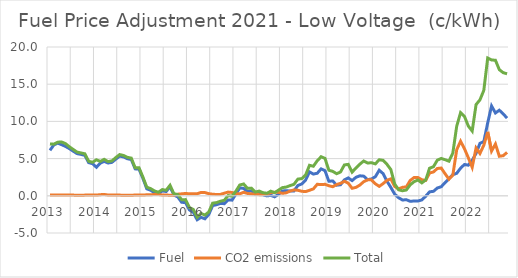
| Category | Fuel | CO2 emissions | Total |
|---|---|---|---|
| 2013.0 | 6.108 | 0.093 | 6.972 |
| 2013.0 | 6.834 | 0.098 | 6.94 |
| 2013.0 | 7.081 | 0.12 | 7.208 |
| 2013.0 | 6.873 | 0.12 | 7.234 |
| 2013.0 | 6.645 | 0.124 | 7.019 |
| 2013.0 | 6.344 | 0.104 | 6.6 |
| 2013.0 | 6 | 0.094 | 6.233 |
| 2013.0 | 5.672 | 0.075 | 5.873 |
| 2013.0 | 5.566 | 0.074 | 5.763 |
| 2013.0 | 5.441 | 0.092 | 5.649 |
| 2013.0 | 4.459 | 0.104 | 4.64 |
| 2013.0 | 4.32 | 0.112 | 4.503 |
| 2014.0 | 3.838 | 0.096 | 4.838 |
| 2014.0 | 4.385 | 0.152 | 4.621 |
| 2014.0 | 4.632 | 0.177 | 4.903 |
| 2014.0 | 4.405 | 0.111 | 4.595 |
| 2014.0 | 4.494 | 0.117 | 4.691 |
| 2014.0 | 4.928 | 0.106 | 5.135 |
| 2014.0 | 5.33 | 0.095 | 5.543 |
| 2014.0 | 5.23 | 0.074 | 5.417 |
| 2014.0 | 4.982 | 0.073 | 5.166 |
| 2014.0 | 4.873 | 0.084 | 5.065 |
| 2014.0 | 3.62 | 0.095 | 3.771 |
| 2014.0 | 3.583 | 0.108 | 3.763 |
| 2015.0 | 2.34 | 0.098 | 2.522 |
| 2015.0 | 0.94 | 0.137 | 1.158 |
| 2015.0 | 0.741 | 0.156 | 0.964 |
| 2015.0 | 0.419 | 0.16 | 0.651 |
| 2015.0 | 0.262 | 0.174 | 0.481 |
| 2015.0 | 0.665 | 0.11 | 0.835 |
| 2015.0 | 0.576 | 0.101 | 0.745 |
| 2015.0 | 1.23 | 0.08 | 1.41 |
| 2015.0 | 0.107 | 0.072 | 0.275 |
| 2015.0 | -0.154 | 0.218 | 0.175 |
| 2015.0 | -0.873 | 0.263 | -0.523 |
| 2015.0 | -0.907 | 0.318 | -0.514 |
| 2016.0 | -1.898 | 0.265 | -1.569 |
| 2016.0 | -2.216 | 0.291 | -1.835 |
| 2016.0 | -3.221 | 0.28 | -2.885 |
| 2016.0 | -2.897 | 0.449 | -2.359 |
| 2016.0 | -3.09 | 0.435 | -2.597 |
| 2016.0 | -2.515 | 0.284 | -2.175 |
| 2016.0 | -1.317 | 0.212 | -0.989 |
| 2016.0 | -1.196 | 0.174 | -0.914 |
| 2016.0 | -1.028 | 0.188 | -0.731 |
| 2016.0 | -1.058 | 0.349 | -0.604 |
| 2016.0 | -0.556 | 0.498 | 0.034 |
| 2016.0 | -0.583 | 0.451 | -0.057 |
| 2017.0 | 0.221 | 0.271 | 0.624 |
| 2017.0 | 1.061 | 0.259 | 1.455 |
| 2017.0 | 0.998 | 0.476 | 1.588 |
| 2017.0 | 0.577 | 0.311 | 1 |
| 2017.0 | 0.667 | 0.265 | 1.029 |
| 2017.0 | 0.206 | 0.211 | 0.5 |
| 2017.0 | 0.356 | 0.154 | 0.636 |
| 2017.0 | 0.128 | 0.159 | 0.419 |
| 2017.0 | -0.012 | 0.227 | 0.338 |
| 2017.0 | 0.059 | 0.432 | 0.621 |
| 2017.0 | -0.135 | 0.473 | 0.419 |
| 2017.0 | 0.197 | 0.469 | 0.758 |
| 2018.0 | 0.654 | 0.335 | 1.098 |
| 2018.0 | 0.679 | 0.401 | 1.17 |
| 2018.0 | 0.65 | 0.64 | 1.376 |
| 2018.0 | 0.653 | 0.79 | 1.547 |
| 2018.0 | 1.385 | 0.745 | 2.246 |
| 2018.0 | 1.591 | 0.606 | 2.307 |
| 2018.0 | 2.116 | 0.571 | 2.795 |
| 2018.0 | 3.213 | 0.74 | 4.099 |
| 2018.0 | 2.92 | 0.929 | 3.973 |
| 2018.0 | 3.031 | 1.544 | 4.71 |
| 2018.0 | 3.621 | 1.514 | 5.251 |
| 2018.0 | 3.38 | 1.542 | 5.03 |
| 2019.0 | 1.952 | 1.355 | 3.432 |
| 2019.0 | 1.997 | 1.22 | 3.286 |
| 2019.0 | 1.427 | 1.51 | 2.969 |
| 2019.0 | 1.482 | 1.678 | 3.197 |
| 2019.0 | 2.138 | 1.949 | 4.143 |
| 2019.0 | 2.406 | 1.694 | 4.228 |
| 2019.0 | 2.044 | 1.012 | 3.178 |
| 2019.0 | 2.488 | 1.132 | 3.746 |
| 2019.0 | 2.688 | 1.444 | 4.255 |
| 2019.0 | 2.641 | 1.897 | 4.676 |
| 2019.0 | 2.17 | 2.143 | 4.403 |
| 2019.0 | 2.26 | 2.144 | 4.448 |
| 2020.0 | 2.567 | 1.613 | 4.292 |
| 2020.0 | 3.433 | 1.269 | 4.844 |
| 2020.0 | 2.981 | 1.635 | 4.766 |
| 2020.0 | 1.96 | 2.089 | 4.23 |
| 2020.0 | 1.124 | 2.275 | 3.523 |
| 2020.0 | 0.217 | 1.248 | 1.583 |
| 2020.0 | -0.258 | 0.93 | 0.804 |
| 2020.0 | -0.566 | 1.138 | 0.676 |
| 2020.0 | -0.527 | 1.202 | 0.785 |
| 2020.0 | -0.74 | 2.061 | 1.477 |
| 2020.0 | -0.699 | 2.458 | 1.898 |
| 2020.0 | -0.699 | 2.458 | 2.118 |
| 2021.0 | -0.555 | 2.159 | 1.735 |
| 2021.0 | -0.058 | 2.07 | 2.138 |
| 2021.0 | 0.533 | 3.067 | 3.704 |
| 2021.0 | 0.602 | 3.207 | 3.91 |
| 2021.0 | 1.049 | 3.671 | 4.79 |
| 2021.0 | 1.219 | 3.728 | 5.022 |
| 2021.0 | 1.765 | 2.964 | 4.853 |
| 2021.0 | 2.302 | 2.234 | 4.652 |
| 2021.0 | 2.834 | 2.779 | 5.744 |
| 2021.0 | 3.024 | 6.188 | 9.345 |
| 2021.0 | 3.708 | 7.333 | 11.177 |
| 2021.0 | 4.21 | 6.334 | 10.678 |
| 2022.0 | 4.113 | 5.111 | 9.374 |
| 2022.0 | 4.777 | 3.824 | 8.702 |
| 2022.0 | 5.699 | 6.436 | 12.262 |
| 2022.0 | 7.048 | 5.69 | 12.896 |
| 2022.0 | 7.294 | 6.802 | 14.171 |
| 2022.0 | 9.796 | 8.589 | 18.513 |
| 2022.0 | 12.071 | 6.015 | 18.253 |
| 2022.0 | 11.134 | 6.959 | 18.22 |
| 2022.0 | 11.503 | 5.314 | 16.953 |
| 2022.0 | 11.015 | 5.392 | 16.551 |
| 2022.0 | 10.438 | 5.835 | 16.399 |